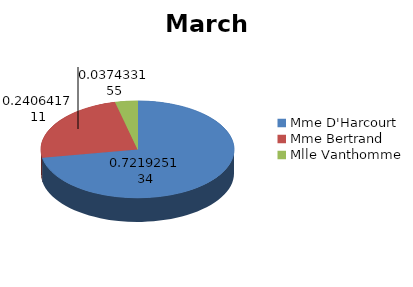
| Category | mars 2013 |
|---|---|
| Mme D'Harcourt | 225 |
| Mme Bertrand | 75 |
| Mlle Vanthomme | 11.667 |